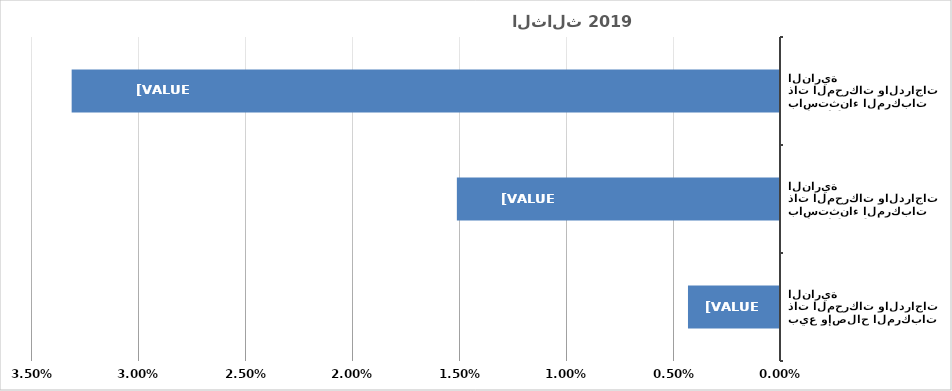
| Category | Series 0 |
|---|---|
| بيع وإصلاح المركبات ذات المحركات والدراجات النارية | 0.004 |
| تجارة الجملة، باستثناء المركبات ذات المحركات والدراجات النارية | 0.015 |
| تجارة التجزئة، باستثناء المركبات ذات المحركات والدراجات النارية | 0.033 |